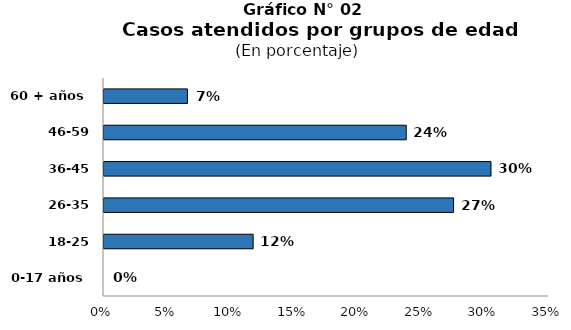
| Category | Series 0 |
|---|---|
| 0-17 años | 0 |
| 18-25 años | 0.117 |
| 26-35 años | 0.275 |
| 36-45 años | 0.304 |
| 46-59 años | 0.238 |
| 60 + años | 0.066 |